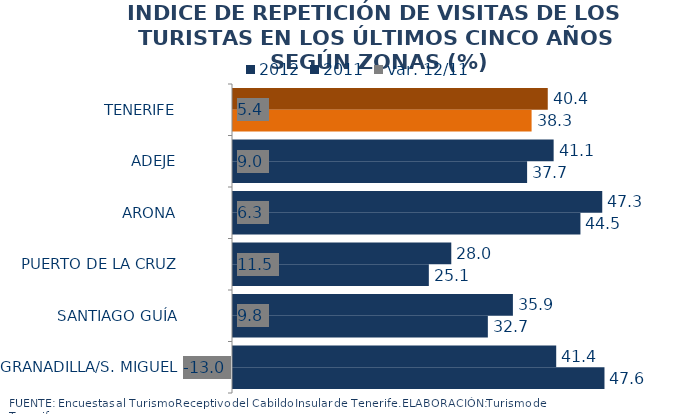
| Category | 2012 | 2011 |
|---|---|---|
| TENERIFE | 40.355 | 38.282 |
| ADEJE | 41.108 | 37.707 |
| ARONA | 47.34 | 44.544 |
| PUERTO DE LA CRUZ | 27.986 | 25.107 |
| SANTIAGO GUÍA | 35.885 | 32.673 |
| GRANADILLA/S. MIGUEL | 41.437 | 47.626 |